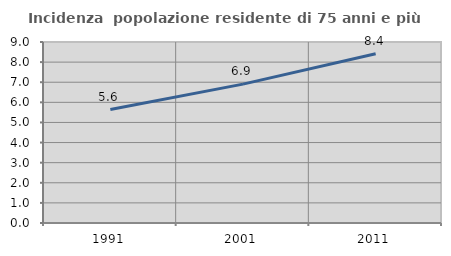
| Category | Incidenza  popolazione residente di 75 anni e più |
|---|---|
| 1991.0 | 5.64 |
| 2001.0 | 6.906 |
| 2011.0 | 8.413 |